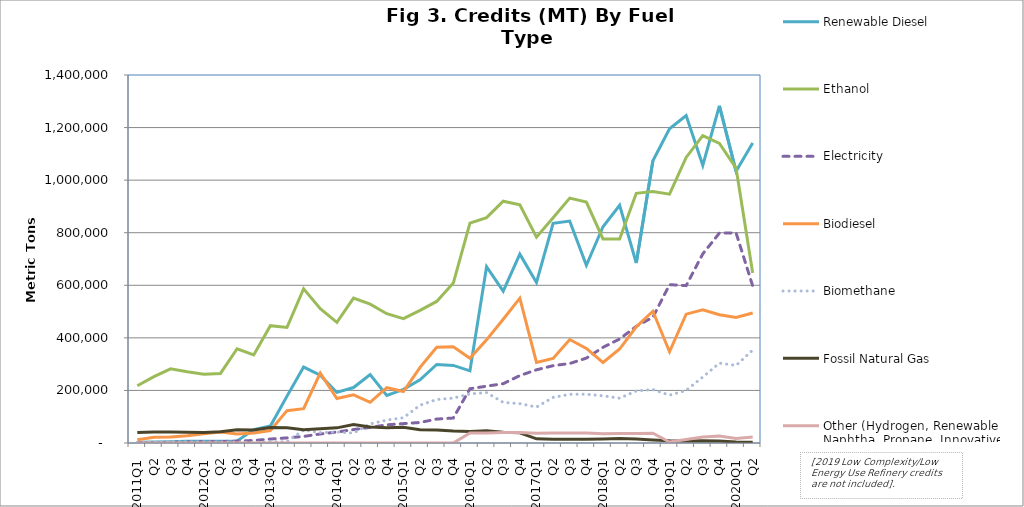
| Category | Renewable Diesel  | Ethanol | Electricity | Biodiesel | Biomethane | Fossil Natural Gas | Other (Hydrogen, Renewable Naphtha, Propane, Innovative Crude & Low Complexity / Low Energy Use Refining, etc.) |
|---|---|---|---|---|---|---|---|
| 2011Q1 | 3070 | 217913 | 459 | 12300 | 2212 | 39934 | 0 |
| Q2 | 3368 | 252550 | 1293 | 21555 | 3069 | 42169 | 0 |
| Q3 | 4362 | 282189 | 2455 | 22424 | 4960 | 41443 | 0 |
| Q4 | 6220 | 270901 | 3536 | 27988 | 4474 | 40844 | 0 |
| 2012Q1 | 6701 | 261269 | 4519 | 35382 | 4367 | 40226 | 0 |
| Q2 | 6804 | 264615 | 5560 | 41919 | 4221 | 43158 | 0 |
| Q3 | 7938 | 358459 | 7294 | 34052 | 3577 | 49942 | 0 |
| Q4 | 51216 | 334751 | 9611 | 37994 | 2680 | 49844 | 0 |
| 2013Q1 | 64445 | 446344 | 15051 | 47386 | 4240 | 59246 | 0 |
| Q2 | 178293 | 439633 | 19516 | 123072 | 5183 | 58045 | 0 |
| Q3 | 288998 | 586902 | 25039 | 130475 | 49133 | 50799 | 0 |
| Q4 | 258193 | 510999 | 34347 | 265737 | 39562 | 53765 | 0 |
| 2014Q1 | 192407 | 459238 | 41753 | 169218 | 41739 | 57641 | 0 |
| Q2 | 211004 | 551332 | 51092 | 183308 | 37894 | 70355 | 0 |
| Q3 | 260522 | 528433 | 59366 | 154934 | 72586 | 60793 | 0 |
| Q4 | 181046 | 491880 | 69119 | 210540 | 87339 | 58227 | 0 |
| 2015Q1 | 204352 | 473209 | 73708 | 195615 | 96047 | 59660 | 0 |
| Q2 | 240167 | 504542 | 78072 | 287973 | 143831 | 50678 | 0 |
| Q3 | 298591 | 538519 | 91036 | 364501 | 165388 | 49578 | 50 |
| Q4 | 295061 | 608484 | 94924 | 365821 | 170686 | 45675 | 24 |
| 2016Q1 | 274568 | 836629 | 206464 | 322607 | 186808 | 43627 | 37975 |
| Q2 | 670559 | 857168 | 216149 | 392318 | 191624 | 46616 | 38243 |
| Q3 | 577586 | 919750 | 225640 | 470922 | 154491 | 40957 | 39843 |
| Q4 | 718504 | 905839 | 256450 | 550936 | 149732 | 38991 | 39493 |
| 2017Q1 | 610652 | 783039 | 278442 | 306640 | 136721 | 16031 | 37028 |
| Q2 | 835625 | 856950 | 294201 | 321909 | 173497 | 14323 | 37617 |
| Q3 | 844159 | 931601 | 302457 | 393587 | 185321 | 14005 | 37717 |
| Q4 | 676294 | 916634 | 323014 | 359942 | 185446 | 14135 | 37644 |
| 2018Q1 | 822711 | 776336 | 363840 | 306337 | 179507 | 15292 | 35569 |
| Q2 | 904125 | 775942 | 395708 | 357508 | 170495 | 16964 | 36090 |
| Q3 | 684773 | 949941 | 443790 | 442007 | 197971 | 14909 | 36240 |
| Q4 | 1073782 | 956765 | 478635 | 501294 | 203315 | 11610 | 37400 |
| 2019Q1 | 1195556 | 946616 | 602432 | 347140 | 181925 | 8133 | 3903 |
| Q2 | 1245746 | 1086445 | 598746 | 490163 | 199923 | 7175 | 13318 |
| Q3 | 1056305 | 1169325 | 719616 | 506350 | 251078 | 8104 | 22802 |
| Q4 | 1282920 | 1139746 | 798737 | 488183 | 303885 | 7391 | 26633 |
| 2020Q1 | 1033524 | 1045825 | 799610 | 477186 | 294992 | 3785 | 16861 |
| Q2 | 1141261 | 646825 | 597761 | 494615 | 353395 | 2471 | 22585 |